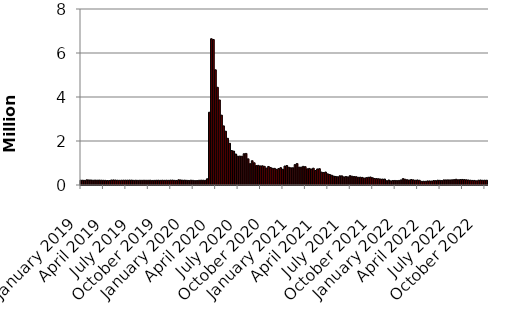
| Category | Series 0 |
|---|---|
| January 2019 | 220000 |
| January 2019 | 216000 |
| January 2019 | 209000 |
| January 2019 | 236000 |
| February 2019 | 230000 |
| February 2019 | 228000 |
| February 2019 | 218000 |
| February 2019 | 224000 |
| March 2019 | 220000 |
| March 2019 | 224000 |
| March 2019 | 219000 |
| March 2019 | 215000 |
| March 2019 | 211000 |
| April 2019 | 203000 |
| April 2019 | 203000 |
| April 2019 | 226000 |
| April 2019 | 230000 |
| May 2019 | 225000 |
| May 2019 | 217000 |
| May 2019 | 213000 |
| May 2019 | 218000 |
| June 2019 | 220000 |
| June 2019 | 220000 |
| June 2019 | 219000 |
| June 2019 | 224000 |
| June 2019 | 222000 |
| July 2019 | 211000 |
| July 2019 | 217000 |
| July 2019 | 211000 |
| July 2019 | 216000 |
| August 2019 | 214000 |
| August 2019 | 218000 |
| August 2019 | 215000 |
| August 2019 | 215000 |
| August 2019 | 219000 |
| September 2019 | 208000 |
| September 2019 | 211000 |
| September 2019 | 215000 |
| September 2019 | 218000 |
| October 2019 | 212000 |
| October 2019 | 218000 |
| September 2019 | 213000 |
| September 2019 | 217000 |
| November 2019 | 212000 |
| November 2019 | 222000 |
| November 2019 | 223000 |
| November 2019 | 211000 |
| November 2019 | 206000 |
| December 2019 | 237000 |
| December 2019 | 229000 |
| December 2019 | 218000 |
| December 2019 | 220000 |
| January 2020 | 212000 |
| January 2020 | 207000 |
| January 2020 | 220000 |
| January 2020 | 212000 |
| February 2020 | 201000 |
| February 2020 | 204000 |
| February 2020 | 215000 |
| February 2020 | 220000 |
| February 2020 | 217000 |
| March 2020 | 211000 |
| March 2020 | 282000 |
| March 2020 | 3307000 |
| March 2020 | 6648000 |
| April 2020 | 6615000 |
| April 2020 | 5237000 |
| April 2020 | 4442000 |
| April 2020 | 3867000 |
| May 2020 | 3176000 |
| May 2020 | 2687000 |
| May 2020 | 2446000 |
| May 2020 | 2123000 |
| May 2020 | 1897000 |
| June 2020 | 1566000 |
| June 2020 | 1540000 |
| June 2020 | 1408000 |
| June 2020 | 1310000 |
| July 2020 | 1314000 |
| July 2020 | 1308000 |
| July 2020 | 1422000 |
| July 2020 | 1435000 |
| August 2020 | 1191000 |
| August 2020 | 971000 |
| August 2020 | 1104000 |
| August 2020 | 1011000 |
| August 2020 | 884000 |
| September 2020 | 893000 |
| September 2020 | 866000 |
| September 2020 | 873000 |
| September 2020 | 849000 |
| October 2020 | 767000 |
| October 2020 | 842000 |
| October 2020 | 797000 |
| October 2020 | 758000 |
| October 2020 | 757000 |
| November 2020 | 711000 |
| November 2020 | 748000 |
| November 2020 | 787000 |
| November 2020 | 716000 |
| December 2020 | 862000 |
| December 2020 | 885000 |
| Decmeber 2020 | 806000 |
| December 2020 | 782000 |
| January 2021 | 784000 |
| January 2021 | 927000 |
| January 2021 | 975000 |
| January 2021 | 812000 |
| January 2021 | 812000 |
| February 2021 | 848000 |
| February 2021 | 834000 |
| February 2021 | 736000 |
| February 2021 | 754000 |
| March 2021 | 725000 |
| March 2021 | 765000 |
| March 2021 | 658000 |
| March 2021 | 729000 |
| April 2021 | 742000 |
| April 2021 | 586000 |
| April 2021 | 566000 |
| April 2021 | 590000 |
| May 2021 | 507000 |
| May 2021 | 478000 |
| May 2021 | 444000 |
| May 2021 | 405000 |
| May 2021 | 388000 |
| June 2021 | 374000 |
| June 2021 | 418000 |
| June 2021 | 416000 |
| July 2021 | 368000 |
| July 2021 | 386000 |
| July 2021 | 368000 |
| July 2021 | 424000 |
| July 2021 | 399000 |
| August 2021 | 387000 |
| August 2021 | 377000 |
| August 2021 | 349000 |
| August 2021 | 354000 |
| August 2021 | 345000 |
| September 2021 | 312000 |
| September 2021 | 335000 |
| September 2021 | 351000 |
| September 2021 | 364000 |
| October 2021 | 329000 |
| October 2021 | 296000 |
| October 2021 | 291000 |
| October 2021 | 283000 |
| November 2021 | 271000 |
| November 2021 | 269000 |
| November 2021 | 270000 |
| November 2021 | 194000 |
| December 2021 | 227000 |
| December 2021 | 188000 |
| December 2021 | 205000 |
| December 2021 | 206000 |
| December 2021 | 200000 |
| January 2022 | 207000 |
| January 2022 | 231000 |
| January 2022 | 290000 |
| January 2022 | 261000 |
| February 2022 | 239000 |
| February 2022 | 225000 |
| February 2022 | 249000 |
| February 2022 | 233000 |
| March 2022 | 216000 |
| March 2022 | 229000 |
| March 2022 | 215000 |
| March 2022 | 166000 |
| March 2022 | 171000 |
| April 2022 | 168000 |
| April 2022 | 186000 |
| April 2022 | 185000 |
| April 2022 | 181000 |
| May 2022 | 202000 |
| May 2022 | 197000 |
| May 2022 | 218000 |
| May 2022 | 211000 |
| June 2022 | 202000 |
| June 2022 | 232000 |
| June 2022 | 231000 |
| June 2022 | 233000 |
| June 2022 | 231000 |
| July 2022 | 236000 |
| July 2022 | 244000 |
| July 2022 | 261000 |
| July 2022 | 237000 |
| August 2022 | 248000 |
| August 2022 | 252000 |
| August 2022 | 245000 |
| August 2022 | 237000 |
| August 2022 | 228000 |
| September 2022 | 218000 |
| September 2022 | 208000 |
| September 2022 | 208000 |
| September 2022 | 190000 |
| October 2022 | 219000 |
| October 2022 | 226000 |
| October 2022 | 214000 |
| October 2022 | 218000 |
| November 2022 | 217000 |